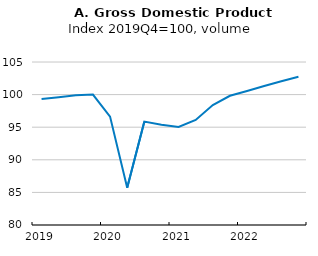
| Category | EU22 |
|---|---|
| 2019.0 | 99.339 |
| 2019.0 | 99.594 |
| 2019.0 | 99.905 |
| 2019.0 | 100 |
| 2020.0 | 96.629 |
| 2020.0 | 85.72 |
| 2020.0 | 95.853 |
| 2020.0 | 95.39 |
| 2021.0 | 95.05 |
| 2021.0 | 96.11 |
| 2021.0 | 98.387 |
| 2021.0 | 99.818 |
| 2022.0 | 100.564 |
| 2022.0 | 101.323 |
| 2022.0 | 102.05 |
| 2022.0 | 102.73 |